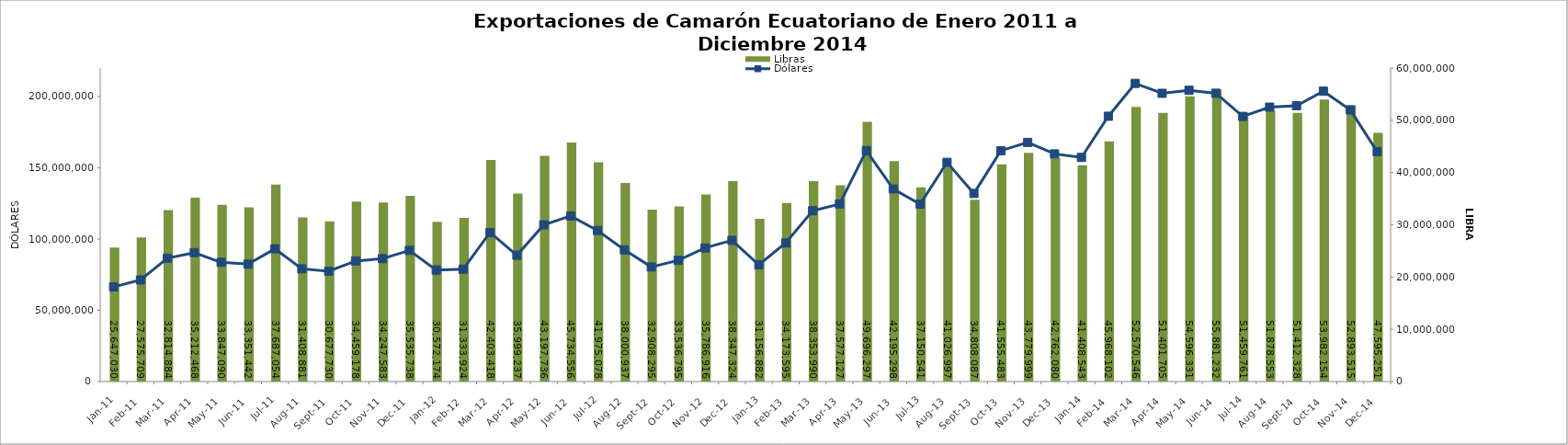
| Category | Libras |
|---|---|
| 2011-01-01 | 25647030 |
| 2011-02-01 | 27575709 |
| 2011-03-01 | 32814884 |
| 2011-04-01 | 35212468 |
| 2011-05-01 | 33847090 |
| 2011-06-01 | 33351442 |
| 2011-07-01 | 37687054 |
| 2011-08-01 | 31408881 |
| 2011-09-01 | 30677730 |
| 2011-10-01 | 34459178 |
| 2011-11-01 | 34247583 |
| 2011-12-01 | 35535738 |
| 2012-01-01 | 30572174 |
| 2012-02-01 | 31333924 |
| 2012-03-01 | 42403418 |
| 2012-04-01 | 35999237 |
| 2012-05-01 | 43197736 |
| 2012-06-01 | 45734556 |
| 2012-07-01 | 41975078 |
| 2012-08-01 | 38000937 |
| 2012-09-01 | 32908295 |
| 2012-10-01 | 33536795 |
| 2012-11-01 | 35786916 |
| 2012-12-01 | 38347324 |
| 2013-01-01 | 31156882 |
| 2013-02-01 | 34173595 |
| 2013-03-01 | 38353990 |
| 2013-04-01 | 37577127 |
| 2013-05-01 | 49696297 |
| 2013-06-01 | 42195298 |
| 2013-07-01 | 37150541 |
| 2013-08-01 | 41026997 |
| 2013-09-01 | 34808087 |
| 2013-10-01 | 41555483 |
| 2013-11-01 | 43779999 |
| 2013-12-01 | 42762080 |
| 2014-01-01 | 41408543 |
| 2014-02-01 | 45968102 |
| 2014-03-01 | 52570546 |
| 2014-04-01 | 51401705 |
| 2014-05-01 | 54596331 |
| 2014-06-01 | 55881232 |
| 2014-07-01 | 51459761 |
| 2014-08-01 | 51878553 |
| 2014-09-01 | 51412328 |
| 2014-10-01 | 53982154 |
| 2014-11-01 | 52893515 |
| 2014-12-01 | 47595251 |